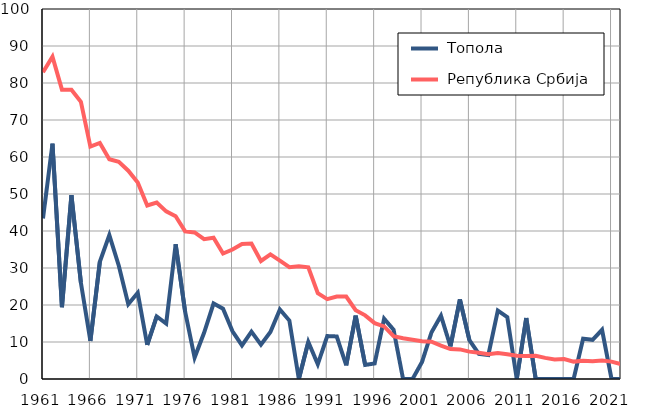
| Category |  Топола |  Република Србија |
|---|---|---|
| 1961.0 | 43.4 | 82.9 |
| 1962.0 | 63.6 | 87.1 |
| 1963.0 | 19.4 | 78.2 |
| 1964.0 | 49.7 | 78.2 |
| 1965.0 | 26 | 74.9 |
| 1966.0 | 10.3 | 62.8 |
| 1967.0 | 31.7 | 63.8 |
| 1968.0 | 38.9 | 59.4 |
| 1969.0 | 30.6 | 58.7 |
| 1970.0 | 20.2 | 56.3 |
| 1971.0 | 23.3 | 53.1 |
| 1972.0 | 9.2 | 46.9 |
| 1973.0 | 16.9 | 47.7 |
| 1974.0 | 15 | 45.3 |
| 1975.0 | 36.4 | 44 |
| 1976.0 | 18.2 | 39.9 |
| 1977.0 | 5.8 | 39.6 |
| 1978.0 | 12.5 | 37.8 |
| 1979.0 | 20.4 | 38.2 |
| 1980.0 | 19 | 33.9 |
| 1981.0 | 12.9 | 35 |
| 1982.0 | 9.1 | 36.5 |
| 1983.0 | 12.8 | 36.6 |
| 1984.0 | 9.3 | 31.9 |
| 1985.0 | 12.7 | 33.7 |
| 1986.0 | 18.8 | 32 |
| 1987.0 | 15.8 | 30.2 |
| 1988.0 | 0 | 30.5 |
| 1989.0 | 10 | 30.2 |
| 1990.0 | 4 | 23.2 |
| 1991.0 | 11.6 | 21.6 |
| 1992.0 | 11.5 | 22.3 |
| 1993.0 | 3.7 | 22.3 |
| 1994.0 | 17.1 | 18.6 |
| 1995.0 | 3.8 | 17.2 |
| 1996.0 | 4.2 | 15.1 |
| 1997.0 | 16.3 | 14.2 |
| 1998.0 | 13.3 | 11.6 |
| 1999.0 | 0 | 11 |
| 2000.0 | 0 | 10.6 |
| 2001.0 | 4.6 | 10.2 |
| 2002.0 | 12.6 | 10.1 |
| 2003.0 | 17.1 | 9 |
| 2004.0 | 8.8 | 8.1 |
| 2005.0 | 21.5 | 8 |
| 2006.0 | 10.5 | 7.4 |
| 2007.0 | 6.8 | 7.1 |
| 2008.0 | 6.5 | 6.7 |
| 2009.0 | 18.5 | 7 |
| 2010.0 | 16.7 | 6.7 |
| 2011.0 | 0 | 6.3 |
| 2012.0 | 16.5 | 6.2 |
| 2013.0 | 0 | 6.3 |
| 2014.0 | 0 | 5.7 |
| 2015.0 | 0 | 5.3 |
| 2016.0 | 0 | 5.4 |
| 2017.0 | 0 | 4.7 |
| 2018.0 | 10.9 | 4.9 |
| 2019.0 | 10.6 | 4.8 |
| 2020.0 | 13.3 | 5 |
| 2021.0 | 0 | 4.7 |
| 2022.0 | 0 | 4 |